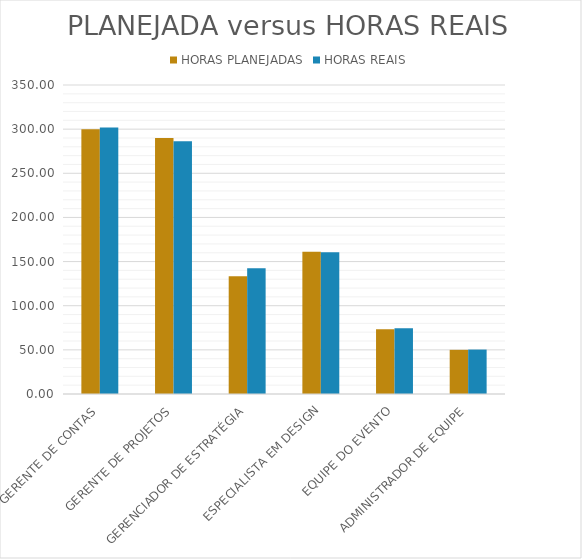
| Category | HORAS PLANEJADAS | HORAS REAIS |
|---|---|---|
| GERENTE DE CONTAS | 300 | 302 |
| GERENTE DE PROJETOS | 290 | 286.333 |
| GERENCIADOR DE ESTRATÉGIA | 133.333 | 142.5 |
| ESPECIALISTA EM DESIGN | 161.111 | 160.556 |
| EQUIPE DO EVENTO | 73.333 | 74.444 |
| ADMINISTRADOR DE EQUIPE | 50 | 50.333 |